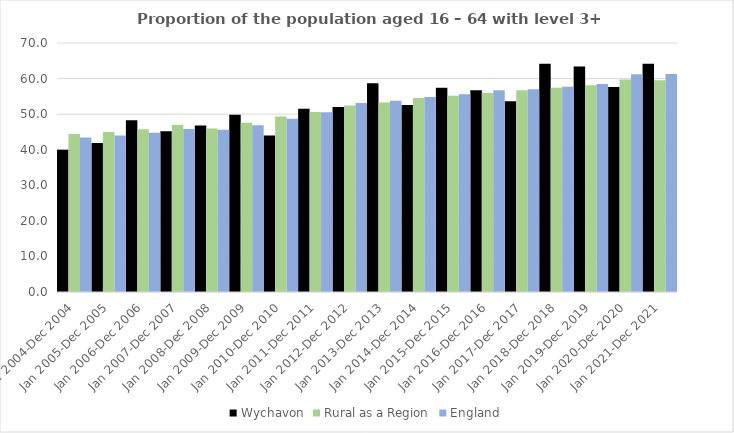
| Category | Wychavon | Rural as a Region | England |
|---|---|---|---|
| Jan 2004-Dec 2004 | 40 | 44.405 | 43.4 |
| Jan 2005-Dec 2005 | 41.9 | 44.973 | 44 |
| Jan 2006-Dec 2006 | 48.3 | 45.774 | 44.8 |
| Jan 2007-Dec 2007 | 45.2 | 46.968 | 45.8 |
| Jan 2008-Dec 2008 | 46.8 | 45.964 | 45.6 |
| Jan 2009-Dec 2009 | 49.8 | 47.59 | 46.9 |
| Jan 2010-Dec 2010 | 44 | 49.362 | 48.7 |
| Jan 2011-Dec 2011 | 51.5 | 50.602 | 50.5 |
| Jan 2012-Dec 2012 | 52 | 52.439 | 53.1 |
| Jan 2013-Dec 2013 | 58.7 | 53.276 | 53.8 |
| Jan 2014-Dec 2014 | 52.6 | 54.57 | 54.8 |
| Jan 2015-Dec 2015 | 57.4 | 55.16 | 55.6 |
| Jan 2016-Dec 2016 | 56.7 | 55.941 | 56.7 |
| Jan 2017-Dec 2017 | 53.6 | 56.689 | 57 |
| Jan 2018-Dec 2018 | 64.2 | 57.389 | 57.7 |
| Jan 2019-Dec 2019 | 63.4 | 58.147 | 58.5 |
| Jan 2020-Dec 2020 | 57.6 | 59.771 | 61.2 |
| Jan 2021-Dec 2021 | 64.2 | 59.54 | 61.3 |